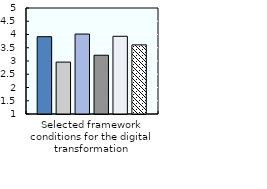
| Category | Armenia | Azerbaijan | Georgia | Moldova | Ukraine | EaP average |
|---|---|---|---|---|---|---|
| Selected framework conditions for the digital transformation | 3.918 | 2.959 | 4.017 | 3.218 | 3.932 | 3.609 |